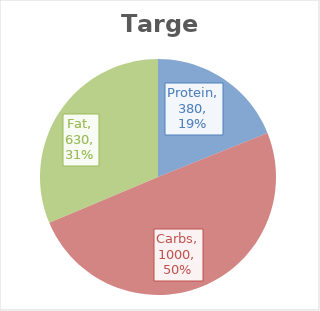
| Category | Target |
|---|---|
| Protein | 380 |
| Carbs | 1000 |
| Fat | 630 |